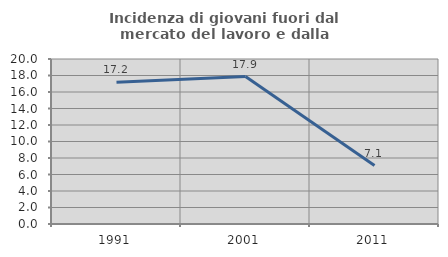
| Category | Incidenza di giovani fuori dal mercato del lavoro e dalla formazione  |
|---|---|
| 1991.0 | 17.184 |
| 2001.0 | 17.869 |
| 2011.0 | 7.087 |